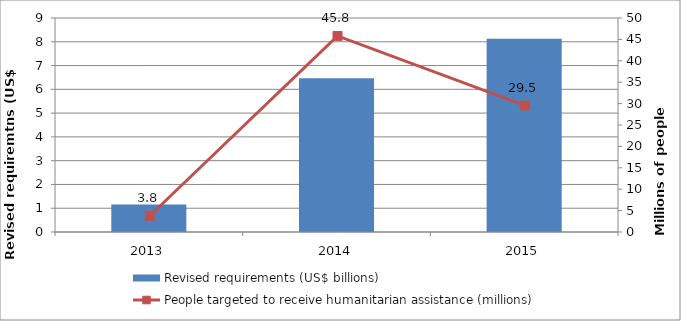
| Category | Revised requirements (US$ billions) |
|---|---|
| 2013.0 | 1.153 |
| 2014.0 | 6.465 |
| 2015.0 | 8.13 |